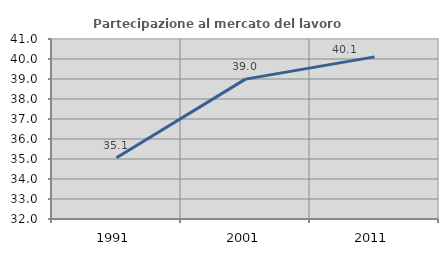
| Category | Partecipazione al mercato del lavoro  femminile |
|---|---|
| 1991.0 | 35.065 |
| 2001.0 | 38.994 |
| 2011.0 | 40.107 |